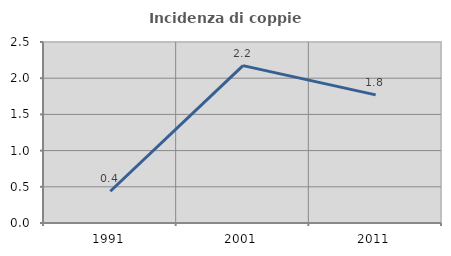
| Category | Incidenza di coppie miste |
|---|---|
| 1991.0 | 0.439 |
| 2001.0 | 2.174 |
| 2011.0 | 1.77 |